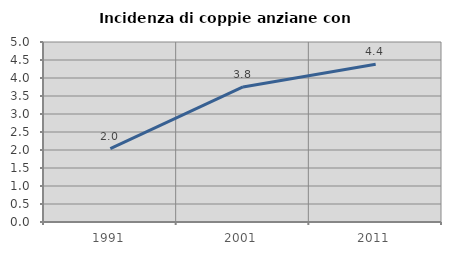
| Category | Incidenza di coppie anziane con figli |
|---|---|
| 1991.0 | 2.039 |
| 2001.0 | 3.751 |
| 2011.0 | 4.382 |